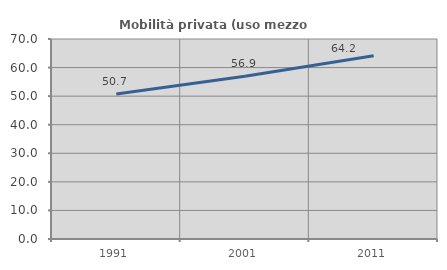
| Category | Mobilità privata (uso mezzo privato) |
|---|---|
| 1991.0 | 50.746 |
| 2001.0 | 56.933 |
| 2011.0 | 64.168 |